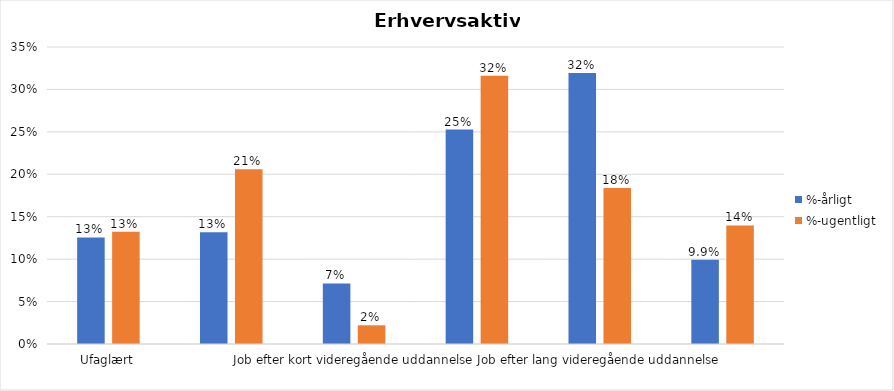
| Category | %-årligt | %-ugentligt |
|---|---|---|
| Ufaglært | 0.126 | 0.132 |
| Erhvervsfagligt job | 0.132 | 0.206 |
| Job efter kort videregående uddannelse | 0.071 | 0.022 |
| Job efter mellemlang videregående uddannelse | 0.253 | 0.316 |
| Job efter lang videregående uddannelse | 0.319 | 0.184 |
| Selvstændig | 0.099 | 0.14 |